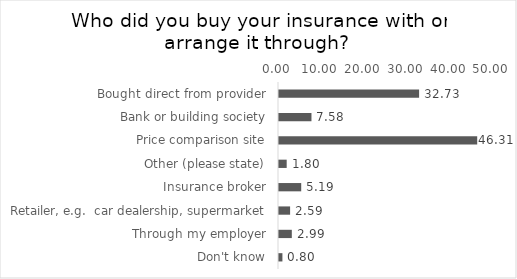
| Category | % of Respondents |
|---|---|
| Bought direct from provider | 32.735 |
| Bank or building society | 7.585 |
| Price comparison site | 46.307 |
| Other (please state) | 1.796 |
| Insurance broker | 5.19 |
| Retailer, e.g.  car dealership, supermarket | 2.595 |
| Through my employer | 2.994 |
| Don't know | 0.798 |